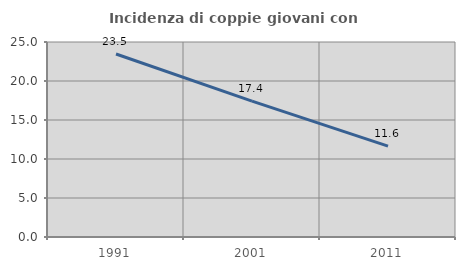
| Category | Incidenza di coppie giovani con figli |
|---|---|
| 1991.0 | 23.464 |
| 2001.0 | 17.414 |
| 2011.0 | 11.645 |